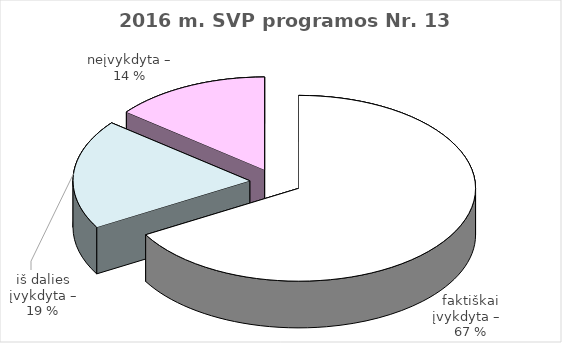
| Category | Series 0 |
|---|---|
| faktiškai įvykdyta –   | 14 |
| iš dalies įvykdyta – | 4 |
| neįvykdyta – | 3 |